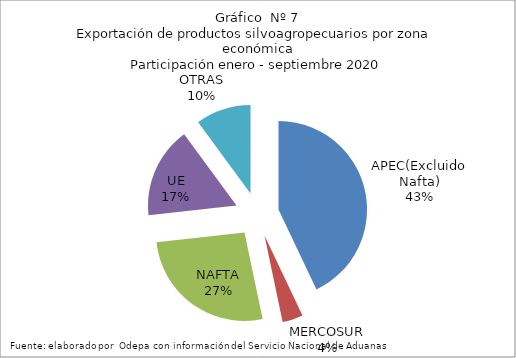
| Category | Series 0 |
|---|---|
| APEC(Excluido Nafta) | 5151727.568 |
| MERCOSUR | 453156.497 |
| NAFTA | 3184750.036 |
| UE | 1999571.318 |
| OTRAS | 1209118.581 |